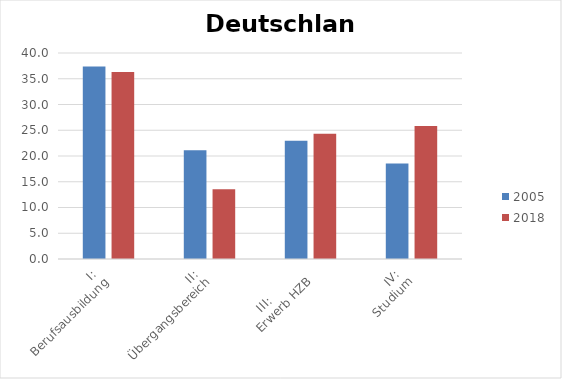
| Category | 2005 | 2018 |
|---|---|---|
| I: 
Berufsausbildung | 37.379 | 36.302 |
| II: 
Übergangsbereich | 21.12 | 13.562 |
| III:           
Erwerb HZB | 22.98 | 24.317 |
| IV: 
Studium | 18.521 | 25.819 |